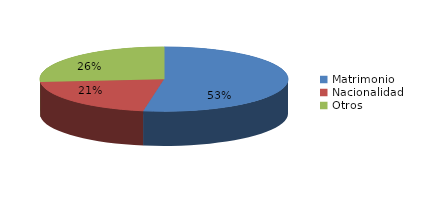
| Category | Series 0 |
|---|---|
| Matrimonio | 2472 |
| Nacionalidad | 982 |
| Otros | 1240 |